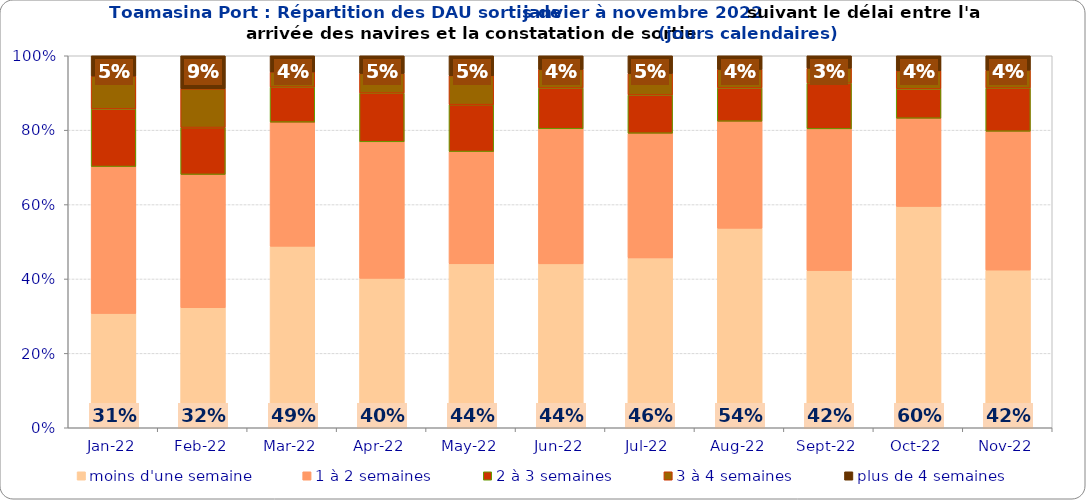
| Category | moins d'une semaine | 1 à 2 semaines | 2 à 3 semaines | 3 à 4 semaines | plus de 4 semaines |
|---|---|---|---|---|---|
| 2022-01-01 | 0.307 | 0.395 | 0.155 | 0.088 | 0.055 |
| 2022-02-01 | 0.323 | 0.358 | 0.126 | 0.104 | 0.089 |
| 2022-03-01 | 0.488 | 0.334 | 0.094 | 0.041 | 0.044 |
| 2022-04-01 | 0.402 | 0.367 | 0.131 | 0.053 | 0.048 |
| 2022-05-01 | 0.441 | 0.302 | 0.126 | 0.078 | 0.054 |
| 2022-06-01 | 0.441 | 0.363 | 0.109 | 0.05 | 0.037 |
| 2022-07-01 | 0.457 | 0.335 | 0.103 | 0.058 | 0.048 |
| 2022-08-01 | 0.536 | 0.288 | 0.09 | 0.05 | 0.037 |
| 2022-09-01 | 0.422 | 0.381 | 0.123 | 0.04 | 0.033 |
| 2022-10-01 | 0.595 | 0.237 | 0.079 | 0.048 | 0.041 |
| 2022-11-01 | 0.424 | 0.373 | 0.116 | 0.048 | 0.039 |